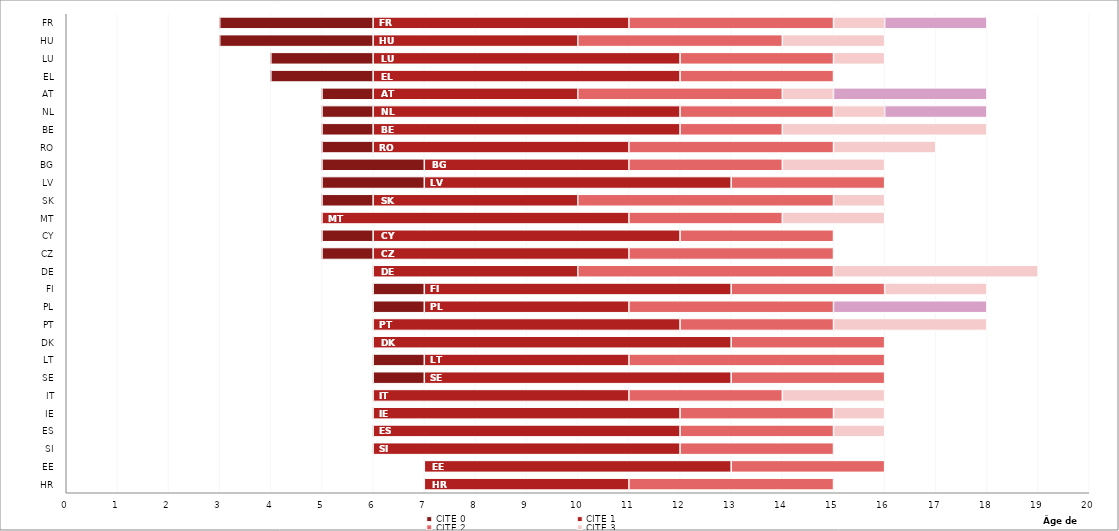
| Category | Âge obligatoire d'entrée dans le sco | CITE 0 | CITE 1 | CITE 2 | CITE 3 | Obligation de formation |
|---|---|---|---|---|---|---|
| HR | 7 | 0 | 4 | 4 | 0 | 0 |
| EE | 7 | 0 | 6 | 3 | 0 | 0 |
| SI | 6 | 0 | 6 | 3 | 0 | 0 |
| ES | 6 | 0 | 6 | 3 | 1 | 0 |
| IE | 6 | 0 | 6 | 3 | 1 | 0 |
| IT | 6 | 0 | 5 | 3 | 2 | 0 |
| SE | 6 | 1 | 6 | 3 | 0 | 0 |
| LT | 6 | 1 | 4 | 5 | 0 | 0 |
| DK | 6 | 0 | 7 | 3 | 0 | 0 |
| PT | 6 | 0 | 6 | 3 | 3 | 0 |
| PL | 6 | 1 | 4 | 4 | 0 | 3 |
| FI | 6 | 1 | 6 | 3 | 2 | 0 |
| DE | 6 | 0 | 4 | 5 | 4 | 0 |
| CZ | 5 | 1 | 5 | 4 | 0 | 0 |
| CY | 5 | 1 | 6 | 3 | 0 | 0 |
| MT | 5 | 0 | 6 | 3 | 2 | 0 |
| SK | 5 | 1 | 4 | 5 | 1 | 0 |
| LV | 5 | 2 | 6 | 3 | 0 | 0 |
| BG | 5 | 2 | 4 | 3 | 2 | 0 |
| RO | 5 | 1 | 5 | 4 | 2 | 0 |
| BE | 5 | 1 | 6 | 2 | 4 | 0 |
| NL | 5 | 1 | 6 | 3 | 1 | 2 |
| AT | 5 | 1 | 4 | 4 | 1 | 3 |
| EL | 4 | 2 | 6 | 3 | 0 | 0 |
| LU | 4 | 2 | 6 | 3 | 1 | 0 |
| HU | 3 | 3 | 4 | 4 | 2 | 0 |
| FR | 3 | 3 | 5 | 4 | 1 | 2 |